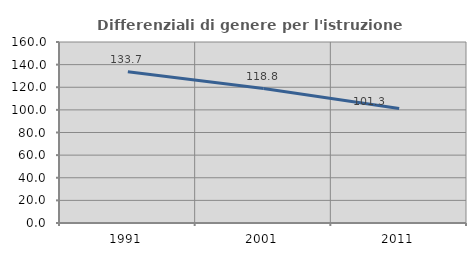
| Category | Differenziali di genere per l'istruzione superiore |
|---|---|
| 1991.0 | 133.668 |
| 2001.0 | 118.831 |
| 2011.0 | 101.251 |